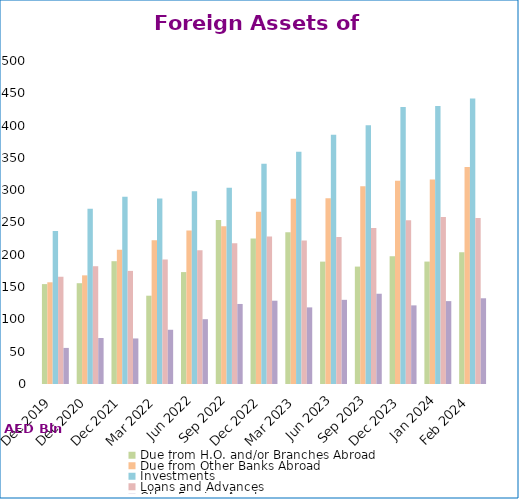
| Category | Due from H.O. and/or Branches Abroad  | Due from Other Banks Abroad | Investments | Loans and Advances | Other Foreign Assets |
|---|---|---|---|---|---|
| Dec 2019 | 154635 | 157442 | 236985 | 166028 | 55858 |
| Dec 2020 | 156027 | 168193 | 271183 | 182313 | 71196 |
| Dec 2021 | 190091 | 207637 | 289677 | 175095 | 70505 |
| Mar 2022 | 136689 | 222427 | 287243 | 192742 | 83948 |
| Jun 2022 | 173237 | 237719 | 298562 | 207166 | 100309 |
| Sep 2022 | 254056 | 244376 | 303666 | 218047 | 123897 |
| Dec 2022 | 225419 | 266827 | 341123 | 228499 | 128935 |
| Mar 2023 | 234952 | 286574 | 359476 | 221999 | 118594 |
| Jun 2023 | 189431 | 287395 | 385821 | 227559 | 130291 |
| Sep 2023 | 181751 | 306266 | 400520 | 241385 | 139722 |
| Dec 2023 | 197785 | 314696 | 428726 | 253652 | 121711 |
| Jan 2024 | 189517 | 316490 | 430516 | 258492 | 128304 |
| Feb 2024 | 203916 | 335847 | 441960 | 256916 | 132688 |